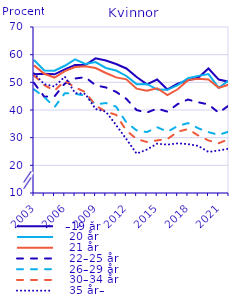
| Category |   –19 år |    20 år |    21 år |    22–25 år |    26–29 år |    30–34 år |    35 år– |
|---|---|---|---|---|---|---|---|
| 2003.0 | 52.965 | 58.084 | 56.138 | 49.803 | 47.461 | 52.47 | 53.206 |
| 2004.0 | 53.113 | 54.308 | 53.093 | 44.811 | 44.682 | 48.989 | 49.333 |
| 2005.0 | 52.896 | 54.231 | 51.738 | 44.924 | 41.029 | 46.986 | 48.504 |
| 2006.0 | 54.66 | 55.993 | 54.063 | 49.559 | 46.079 | 50.564 | 52.049 |
| 2007.0 | 56.231 | 58.282 | 55.522 | 51.379 | 45.85 | 48.188 | 46.142 |
| 2008.0 | 56.263 | 56.659 | 55.802 | 51.877 | 45.196 | 46.493 | 45.845 |
| 2009.0 | 58.671 | 57.335 | 55.155 | 48.933 | 42.018 | 41.6 | 40.362 |
| 2010.0 | 57.882 | 55.202 | 53.368 | 48.152 | 42.522 | 39.405 | 39.409 |
| 2011.0 | 56.62 | 54.272 | 51.792 | 46.569 | 41.209 | 38.258 | 34.546 |
| 2012.0 | 55.007 | 52.298 | 51.067 | 44.022 | 35.493 | 32.578 | 29.47 |
| 2013.0 | 51.925 | 49.345 | 47.703 | 39.974 | 32.637 | 29.498 | 24.237 |
| 2014.0 | 49.276 | 49.427 | 46.948 | 39.078 | 32.018 | 28.445 | 25.701 |
| 2015.0 | 51.033 | 47.406 | 47.876 | 40.525 | 33.788 | 29.021 | 27.832 |
| 2016.0 | 47.446 | 47.304 | 45.408 | 39.407 | 32.144 | 29.503 | 27.475 |
| 2017.0 | 49.492 | 49.001 | 47.482 | 42.147 | 34.218 | 32.134 | 27.946 |
| 2018.0 | 50.768 | 51.478 | 50.795 | 43.779 | 35.271 | 33.11 | 27.662 |
| 2019.0 | 51.628 | 52.332 | 51.32 | 42.798 | 33.396 | 30.796 | 27.034 |
| 2020.0 | 55 | 53 | 51 | 42 | 32 | 29 | 24.836 |
| 2021.0 | 51 | 48 | 48 | 39 | 31 | 28 | 25.372 |
| 2022.0 | 50.184 | 50.796 | 49.181 | 41.687 | 32.242 | 29.52 | 26.032 |